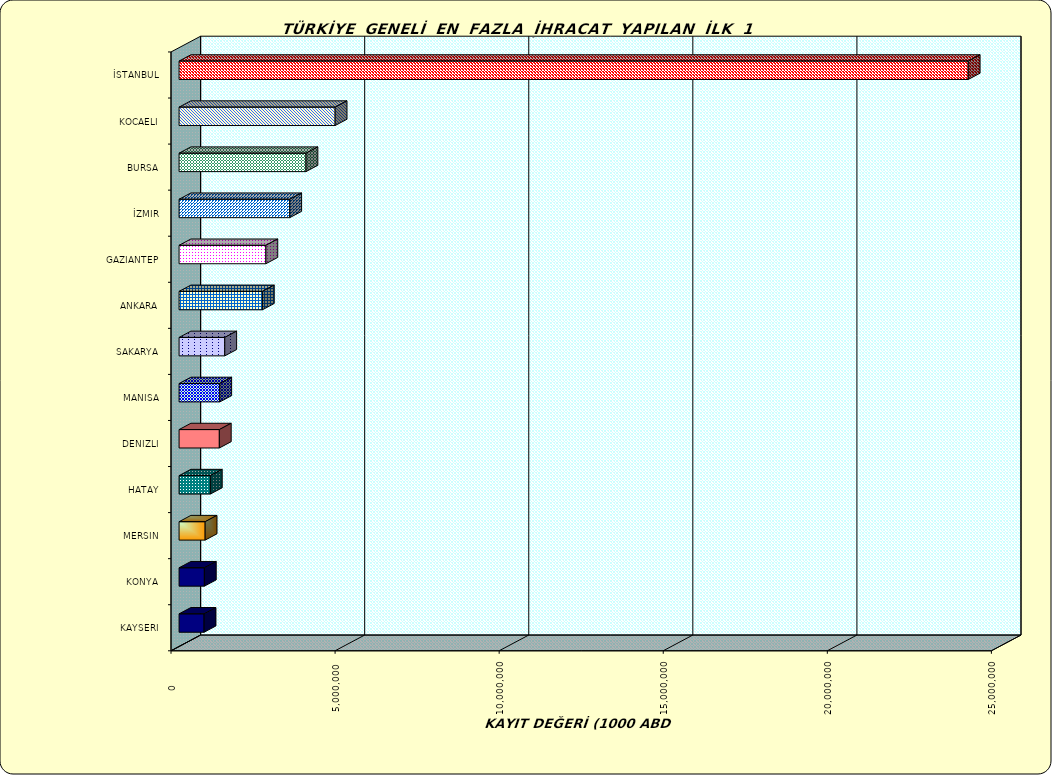
| Category | Series 0 |
|---|---|
| İSTANBUL | 24048378.401 |
| KOCAELI | 4755908.972 |
| BURSA | 3867530.463 |
| İZMIR | 3372341.319 |
| GAZIANTEP | 2645119.481 |
| ANKARA | 2538669.034 |
| SAKARYA | 1392278.034 |
| MANISA | 1240135.242 |
| DENIZLI | 1226704.279 |
| HATAY | 952858.379 |
| MERSIN | 794641.93 |
| KONYA | 770648.777 |
| KAYSERI | 761940.493 |